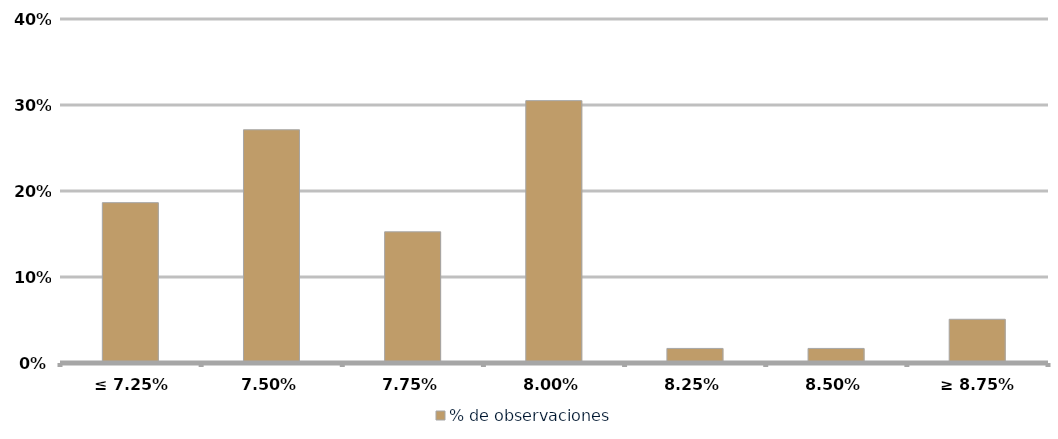
| Category | % de observaciones  |
|---|---|
| ≤ 7.25% | 0.186 |
| 7.50% | 0.271 |
| 7.75% | 0.153 |
| 8.00% | 0.305 |
| 8.25% | 0.017 |
| 8.50% | 0.017 |
| ≥ 8.75% | 0.051 |